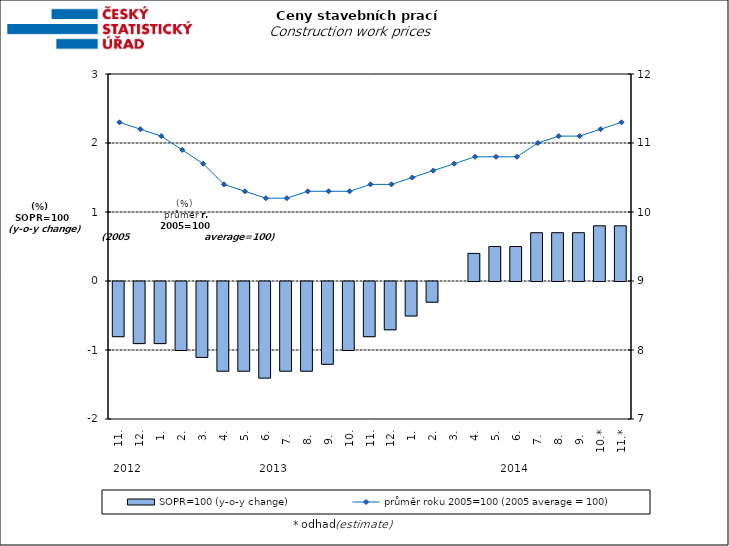
| Category | SOPR=100 (y-o-y change)   |
|---|---|
| 0 | -0.8 |
| 1 | -0.9 |
| 2 | -0.9 |
| 3 | -1 |
| 4 | -1.1 |
| 5 | -1.3 |
| 6 | -1.3 |
| 7 | -1.4 |
| 8 | -1.3 |
| 9 | -1.3 |
| 10 | -1.2 |
| 11 | -1 |
| 12 | -0.8 |
| 13 | -0.7 |
| 14 | -0.5 |
| 15 | -0.3 |
| 16 | 0 |
| 17 | 0.4 |
| 18 | 0.5 |
| 19 | 0.5 |
| 20 | 0.7 |
| 21 | 0.7 |
| 22 | 0.7 |
| 23 | 0.8 |
| 24 | 0.8 |